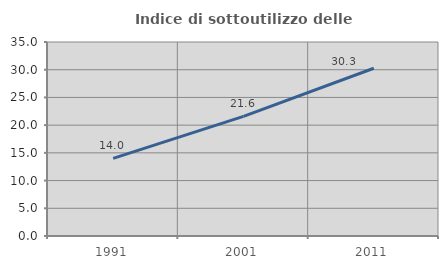
| Category | Indice di sottoutilizzo delle abitazioni  |
|---|---|
| 1991.0 | 14.003 |
| 2001.0 | 21.58 |
| 2011.0 | 30.26 |